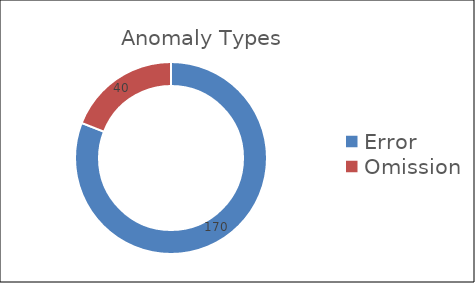
| Category | Total |
|---|---|
| Error | 170 |
| Omission | 40 |